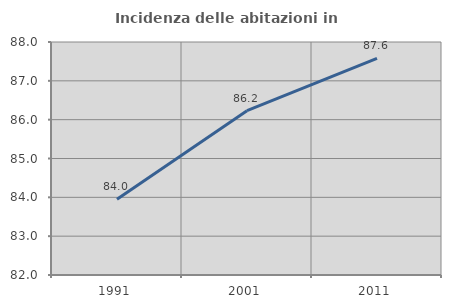
| Category | Incidenza delle abitazioni in proprietà  |
|---|---|
| 1991.0 | 83.951 |
| 2001.0 | 86.231 |
| 2011.0 | 87.576 |